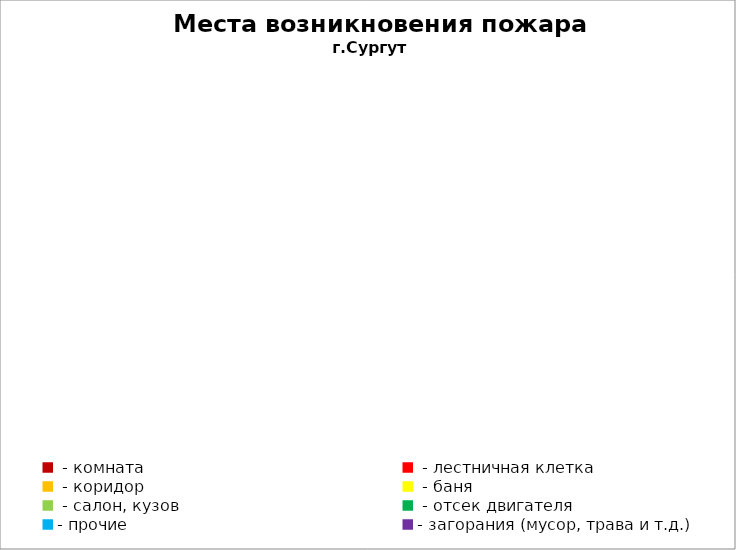
| Category | Места возникновения пожара |
|---|---|
|  - комната | 3 |
|  - лестничная клетка | 1 |
|  - коридор | 0 |
|  - баня | 2 |
|  - салон, кузов | 2 |
|  - отсек двигателя | 9 |
| - прочие | 24 |
| - загорания (мусор, трава и т.д.)  | 3 |